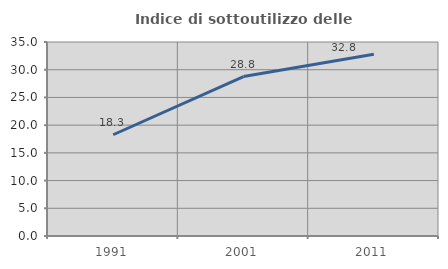
| Category | Indice di sottoutilizzo delle abitazioni  |
|---|---|
| 1991.0 | 18.267 |
| 2001.0 | 28.764 |
| 2011.0 | 32.809 |